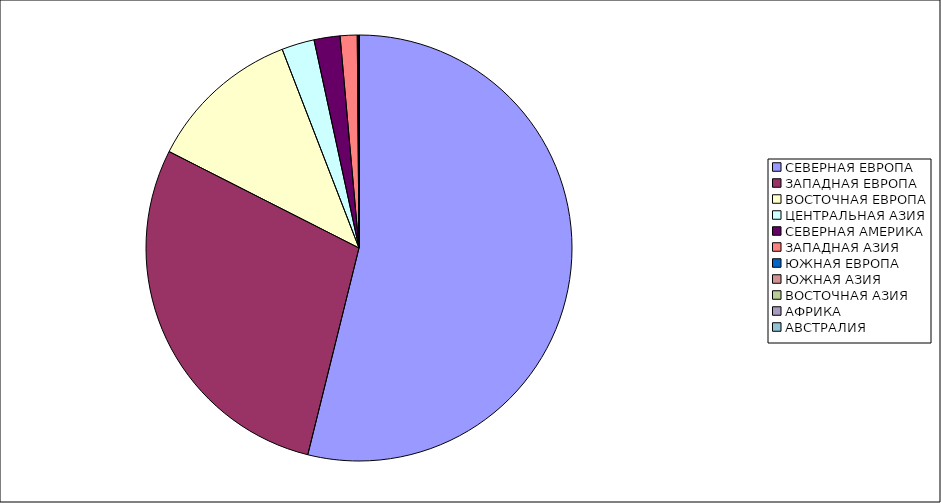
| Category | Оборот |
|---|---|
| СЕВЕРНАЯ ЕВРОПА | 53.86 |
| ЗАПАДНАЯ ЕВРОПА | 28.61 |
| ВОСТОЧНАЯ ЕВРОПА | 11.65 |
| ЦЕНТРАЛЬНАЯ АЗИЯ | 2.48 |
| СЕВЕРНАЯ АМЕРИКА | 1.97 |
| ЗАПАДНАЯ АЗИЯ | 1.29 |
| ЮЖНАЯ ЕВРОПА | 0.09 |
| ЮЖНАЯ АЗИЯ | 0.03 |
| ВОСТОЧНАЯ АЗИЯ | 0.01 |
| АФРИКА | 0 |
| АВСТРАЛИЯ | 0 |